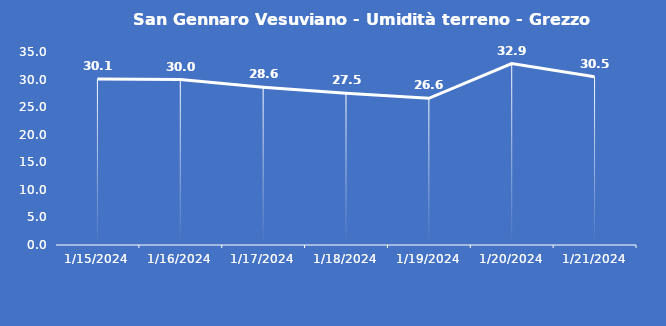
| Category | San Gennaro Vesuviano - Umidità terreno - Grezzo (%VWC) |
|---|---|
| 1/15/24 | 30.1 |
| 1/16/24 | 30 |
| 1/17/24 | 28.6 |
| 1/18/24 | 27.5 |
| 1/19/24 | 26.6 |
| 1/20/24 | 32.9 |
| 1/21/24 | 30.5 |